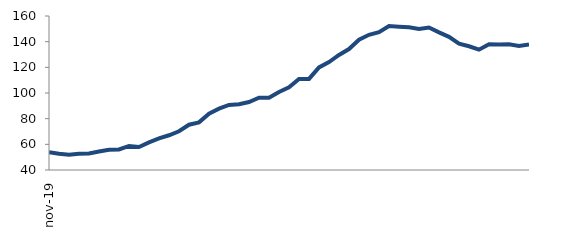
| Category | Series 0 |
|---|---|
| 2019-11-01 | 53.924 |
| 2019-12-01 | 52.607 |
| 2020-01-01 | 51.869 |
| 2020-02-01 | 52.619 |
| 2020-03-01 | 52.83 |
| 2020-04-01 | 54.43 |
| 2020-05-01 | 55.851 |
| 2020-06-01 | 56.062 |
| 2020-07-01 | 58.766 |
| 2020-08-01 | 57.967 |
| 2020-09-01 | 61.563 |
| 2020-10-01 | 64.611 |
| 2020-11-01 | 67.053 |
| 2020-12-01 | 70.207 |
| 2021-01-01 | 75.283 |
| 2021-02-01 | 77.125 |
| 2021-03-01 | 83.917 |
| 2021-04-01 | 87.772 |
| 2021-05-01 | 90.698 |
| 2021-06-01 | 91.254 |
| 2021-07-01 | 92.957 |
| 2021-08-01 | 96.281 |
| 2021-09-01 | 96.228 |
| 2021-10-01 | 100.807 |
| 2021-11-01 | 104.506 |
| 2021-12-01 | 110.93 |
| 2022-01-01 | 110.966 |
| 2022-02-01 | 119.928 |
| 2022-03-01 | 124.133 |
| 2022-04-01 | 129.687 |
| 2022-05-01 | 134.267 |
| 2022-06-01 | 141.471 |
| 2022-07-01 | 145.357 |
| 2022-08-01 | 147.378 |
| 2022-09-01 | 152.132 |
| 2022-10-01 | 151.659 |
| 2022-11-01 | 151.229 |
| 2022-12-01 | 149.84 |
| 2023-01-01 | 151.047 |
| 2023-02-01 | 147.233 |
| 2023-03-01 | 143.736 |
| 2023-04-01 | 138.403 |
| 2023-05-01 | 136.434 |
| 2023-06-01 | 133.747 |
| 2023-07-01 | 138.012 |
| 2023-08-01 | 137.887 |
| 2023-09-01 | 137.892 |
| 2023-10-01 | 136.697 |
| 2023-11-01 | 137.783 |